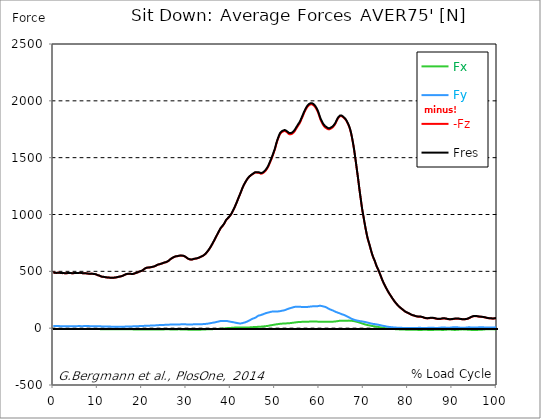
| Category |  Fx |  Fy |  -Fz |  Fres |
|---|---|---|---|---|
| 0.0 | -6.968 | 18.314 | 486.68 | 487.094 |
| 0.167348456675344 | -7.033 | 18.333 | 487.087 | 487.502 |
| 0.334696913350688 | -7.091 | 18.307 | 487.489 | 487.903 |
| 0.5020453700260321 | -6.974 | 18.281 | 486.654 | 487.062 |
| 0.669393826701376 | -6.826 | 18.268 | 485.838 | 486.246 |
| 0.83674228337672 | -6.826 | 18.191 | 486.401 | 486.809 |
| 1.0040907400520642 | -6.871 | 18.145 | 487.159 | 487.56 |
| 1.1621420602454444 | -7.026 | 18.074 | 487.619 | 488.02 |
| 1.3294905169207885 | -7.078 | 17.99 | 487.301 | 487.703 |
| 1.4968389735961325 | -7.11 | 17.919 | 486.602 | 486.997 |
| 1.6641874302714765 | -7.078 | 17.847 | 485.566 | 485.967 |
| 1.8315358869468206 | -7.052 | 17.809 | 484.646 | 485.041 |
| 1.9988843436221646 | -7.039 | 17.802 | 483.947 | 484.348 |
| 2.1662328002975086 | -7.143 | 17.873 | 484.258 | 484.653 |
| 2.333581256972853 | -7.253 | 17.86 | 484.581 | 484.983 |
| 2.5009297136481967 | -7.13 | 17.828 | 483.571 | 483.973 |
| 2.6682781703235405 | -7.052 | 17.718 | 482.962 | 483.357 |
| 2.8356266269988843 | -7.188 | 17.711 | 483.228 | 483.623 |
| 3.002975083674229 | -7.285 | 17.815 | 483.785 | 484.18 |
| 3.1703235403495724 | -7.285 | 17.802 | 484.031 | 484.432 |
| 3.337671997024917 | -7.195 | 17.776 | 484.251 | 484.646 |
| 3.4957233172182973 | -7.098 | 17.737 | 484.899 | 485.287 |
| 3.663071773893641 | -7.123 | 17.653 | 485.553 | 485.941 |
| 3.8304202305689854 | -7.085 | 17.601 | 484.95 | 485.339 |
| 3.997768687244329 | -6.968 | 17.543 | 484.057 | 484.439 |
| 4.165117143919673 | -6.897 | 17.563 | 483.616 | 484.005 |
| 4.332465600595017 | -6.903 | 17.614 | 483.357 | 483.746 |
| 4.499814057270361 | -6.962 | 17.673 | 483.429 | 483.817 |
| 4.667162513945706 | -6.949 | 17.711 | 484.16 | 484.549 |
| 4.834510970621049 | -6.994 | 17.75 | 485.177 | 485.566 |
| 5.001859427296393 | -7.052 | 17.796 | 485.967 | 486.362 |
| 5.169207883971737 | -7.052 | 17.854 | 485.909 | 486.31 |
| 5.336556340647081 | -7.013 | 17.906 | 485.766 | 486.161 |
| 5.503904797322425 | -6.968 | 17.97 | 485.028 | 485.43 |
| 5.671253253997769 | -7.007 | 17.996 | 485.818 | 486.22 |
| 5.82930457419115 | -7.169 | 18.009 | 486.647 | 487.049 |
| 5.996653030866494 | -7.272 | 17.977 | 486.505 | 486.906 |
| 6.164001487541838 | -7.266 | 17.873 | 486.11 | 486.511 |
| 6.331349944217181 | -7.376 | 17.88 | 485.617 | 486.019 |
| 6.498698400892526 | -7.311 | 17.86 | 483.901 | 484.303 |
| 6.66604685756787 | -7.266 | 17.899 | 482.606 | 483.008 |
| 6.833395314243213 | -7.344 | 18.003 | 482.567 | 482.975 |
| 7.000743770918558 | -7.434 | 18.106 | 482.768 | 483.183 |
| 7.168092227593902 | -7.493 | 18.126 | 482.917 | 483.331 |
| 7.335440684269246 | -7.493 | 18.087 | 482.574 | 482.988 |
| 7.50278914094459 | -7.441 | 18.061 | 481.551 | 481.965 |
| 7.6701375976199335 | -7.331 | 18.029 | 480.243 | 480.65 |
| 7.837486054295278 | -7.266 | 18.003 | 479.342 | 479.75 |
| 7.995537374488658 | -7.298 | 17.983 | 479.116 | 479.524 |
| 8.162885831164003 | -7.311 | 17.958 | 478.967 | 479.375 |
| 8.330234287839346 | -7.24 | 17.925 | 479.129 | 479.537 |
| 8.49758274451469 | -7.201 | 17.906 | 479.297 | 479.705 |
| 8.664931201190035 | -7.175 | 17.893 | 479.472 | 479.873 |
| 8.832279657865378 | -7.136 | 17.932 | 478.837 | 479.239 |
| 8.999628114540721 | -6.981 | 17.912 | 477.328 | 477.73 |
| 9.166976571216066 | -7.046 | 17.828 | 476.169 | 476.571 |
| 9.334325027891412 | -7.182 | 17.789 | 475.774 | 476.176 |
| 9.501673484566755 | -7.344 | 17.796 | 474.706 | 475.114 |
| 9.669021941242098 | -7.37 | 17.809 | 472.504 | 472.918 |
| 9.836370397917442 | -7.836 | 17.439 | 468.657 | 469.065 |
| 10.003718854592787 | -8.011 | 17.122 | 465.873 | 466.281 |
| 10.17106731126813 | -8.082 | 16.928 | 464.772 | 465.173 |
| 10.329118631461512 | -8.095 | 16.87 | 463.049 | 463.457 |
| 10.496467088136853 | -8.328 | 16.494 | 459.882 | 460.284 |
| 10.663815544812199 | -8.71 | 15.989 | 456.379 | 456.781 |
| 10.831164001487544 | -9.04 | 15.523 | 453.413 | 453.815 |
| 10.998512458162887 | -9.131 | 15.283 | 452.04 | 452.435 |
| 11.16586091483823 | -9.248 | 15.231 | 451.846 | 452.247 |
| 11.333209371513574 | -9.293 | 15.128 | 451.211 | 451.613 |
| 11.50055782818892 | -9.345 | 15.063 | 450.136 | 450.544 |
| 11.667906284864264 | -9.429 | 14.933 | 448.77 | 449.171 |
| 11.835254741539607 | -9.532 | 14.707 | 447.546 | 447.947 |
| 12.00260319821495 | -9.643 | 14.506 | 446.652 | 447.047 |
| 12.169951654890292 | -9.759 | 14.312 | 445.869 | 446.264 |
| 12.337300111565641 | -9.804 | 14.273 | 445.37 | 445.765 |
| 12.504648568240984 | -9.843 | 14.15 | 444.858 | 445.254 |
| 12.662699888434362 | -9.882 | 13.93 | 444.327 | 444.716 |
| 12.830048345109708 | -9.927 | 13.696 | 444.062 | 444.45 |
| 12.997396801785053 | -9.966 | 13.47 | 443.887 | 444.269 |
| 13.164745258460396 | -9.96 | 13.418 | 443.745 | 444.127 |
| 13.33209371513574 | -9.921 | 13.353 | 443.719 | 444.101 |
| 13.499442171811083 | -9.876 | 13.282 | 443.732 | 444.107 |
| 13.666790628486426 | -9.902 | 13.243 | 444.068 | 444.444 |
| 13.834139085161771 | -9.986 | 13.243 | 444.638 | 445.02 |
| 14.001487541837117 | -10.135 | 13.295 | 445.344 | 445.733 |
| 14.16883599851246 | -10.187 | 13.198 | 446.445 | 446.834 |
| 14.336184455187803 | -10.18 | 13.101 | 447.811 | 448.194 |
| 14.503532911863147 | -10.135 | 13.029 | 449.424 | 449.806 |
| 14.670881368538492 | -10.128 | 13.127 | 451.451 | 451.833 |
| 14.828932688731873 | -10.264 | 13.049 | 452.837 | 453.225 |
| 14.996281145407215 | -10.348 | 12.991 | 453.711 | 454.1 |
| 15.163629602082558 | -10.355 | 13.01 | 454.708 | 455.103 |
| 15.330978058757903 | -10.42 | 13.049 | 456.496 | 456.891 |
| 15.498326515433247 | -10.4 | 13.159 | 458.652 | 459.041 |
| 15.665674972108594 | -10.394 | 13.243 | 461.152 | 461.547 |
| 15.833023428783937 | -10.316 | 13.334 | 464.215 | 464.603 |
| 16.00037188545928 | -10.187 | 13.431 | 467.446 | 467.835 |
| 16.167720342134626 | -10.18 | 13.599 | 470.853 | 471.241 |
| 16.335068798809967 | -10.29 | 13.839 | 473.566 | 473.967 |
| 16.502417255485312 | -10.193 | 14.078 | 475.761 | 476.163 |
| 16.669765712160658 | -10.245 | 14.292 | 477.192 | 477.6 |
| 16.837114168836 | -10.174 | 14.37 | 477.62 | 478.021 |
| 17.004462625511344 | -10.038 | 14.493 | 477.73 | 478.138 |
| 17.16251394570472 | -10.044 | 14.83 | 478.462 | 478.883 |
| 17.32986240238007 | -10.148 | 15.115 | 478.87 | 479.304 |
| 17.497210859055414 | -10.303 | 15.374 | 477.445 | 477.885 |
| 17.664559315730756 | -10.497 | 15.6 | 476.111 | 476.571 |
| 17.8319077724061 | -10.62 | 15.723 | 476.448 | 476.914 |
| 17.999256229081443 | -10.698 | 15.853 | 477.341 | 477.808 |
| 18.166604685756788 | -10.692 | 15.969 | 478.999 | 479.472 |
| 18.333953142432133 | -10.873 | 16.112 | 481.194 | 481.667 |
| 18.501301599107478 | -11.041 | 16.371 | 483.778 | 484.264 |
| 18.668650055782823 | -11.151 | 16.805 | 486.414 | 486.919 |
| 18.835998512458165 | -11.106 | 16.883 | 487.755 | 488.26 |
| 19.00334696913351 | -11.1 | 17.161 | 489.963 | 490.474 |
| 19.170695425808855 | -11.229 | 17.588 | 493.363 | 493.887 |
| 19.338043882484197 | -11.372 | 18.048 | 496.73 | 497.274 |
| 19.496095202677576 | -11.456 | 18.417 | 498.945 | 499.495 |
| 19.66344365935292 | -11.462 | 18.45 | 500.745 | 501.302 |
| 19.830792116028263 | -11.559 | 18.663 | 502.882 | 503.439 |
| 19.998140572703612 | -11.695 | 18.916 | 505.434 | 506.003 |
| 20.165489029378953 | -11.903 | 19.317 | 509.649 | 510.239 |
| 20.3328374860543 | -11.98 | 19.758 | 514.202 | 514.798 |
| 20.500185942729644 | -12.026 | 20.282 | 519.752 | 520.367 |
| 20.667534399404985 | -12.065 | 20.762 | 524.764 | 525.392 |
| 20.83488285608033 | -12.116 | 21.202 | 528.475 | 529.116 |
| 21.002231312755672 | -11.974 | 21.519 | 530.929 | 531.583 |
| 21.16957976943102 | -12 | 21.597 | 532.211 | 532.865 |
| 21.336928226106362 | -12.097 | 21.791 | 532.801 | 533.468 |
| 21.504276682781704 | -12.207 | 22.005 | 533.26 | 533.947 |
| 21.67162513945705 | -12.155 | 22.167 | 533.72 | 534.413 |
| 21.82967645965043 | -12.09 | 22.322 | 534.18 | 534.873 |
| 21.997024916325774 | -12.129 | 22.627 | 535.928 | 536.634 |
| 22.16437337300112 | -12.142 | 22.937 | 537.599 | 538.311 |
| 22.33172182967646 | -12.052 | 23.235 | 538.868 | 539.594 |
| 22.499070286351806 | -11.967 | 23.514 | 540.261 | 540.992 |
| 22.666418743027148 | -11.909 | 23.76 | 541.847 | 542.586 |
| 22.833767199702496 | -11.844 | 23.999 | 543.434 | 544.179 |
| 23.00111565637784 | -11.851 | 24.42 | 546.516 | 547.281 |
| 23.168464113053183 | -11.987 | 24.945 | 550.434 | 551.218 |
| 23.335812569728528 | -12.058 | 25.444 | 554.164 | 554.967 |
| 23.50316102640387 | -11.922 | 25.994 | 557.26 | 558.069 |
| 23.670509483079215 | -11.708 | 26.532 | 559.85 | 560.679 |
| 23.83785793975456 | -11.611 | 26.849 | 561.229 | 562.065 |
| 23.995909259947936 | -11.663 | 27.05 | 562.389 | 563.231 |
| 24.163257716623285 | -11.657 | 27.237 | 564.299 | 565.147 |
| 24.330606173298627 | -11.579 | 27.555 | 566.954 | 567.809 |
| 24.49795462997397 | -11.449 | 27.891 | 569.162 | 570.03 |
| 24.665303086649313 | -11.236 | 28.28 | 570.84 | 571.72 |
| 24.83265154332466 | -11.002 | 28.597 | 573.909 | 574.79 |
| 25.0 | -10.75 | 28.772 | 576.797 | 577.665 |
| 25.167348456675345 | -10.543 | 28.999 | 578.462 | 579.336 |
| 25.334696913350694 | -10.148 | 29.439 | 579.051 | 579.945 |
| 25.502045370026035 | -9.966 | 29.834 | 581.648 | 582.548 |
| 25.669393826701377 | -9.882 | 30.067 | 584.601 | 585.501 |
| 25.836742283376722 | -9.746 | 30.249 | 587.748 | 588.642 |
| 26.004090740052067 | -9.856 | 30.585 | 592.242 | 593.136 |
| 26.17143919672741 | -10.484 | 31.162 | 597.494 | 598.427 |
| 26.329490516920792 | -11.074 | 31.421 | 604.093 | 605.032 |
| 26.49683897359613 | -11.346 | 31.622 | 609.442 | 610.394 |
| 26.66418743027148 | -11.527 | 31.809 | 613.516 | 614.467 |
| 26.831535886946828 | -11.579 | 31.965 | 617.148 | 618.1 |
| 26.998884343622166 | -11.456 | 32.036 | 620.626 | 621.578 |
| 27.166232800297514 | -11.313 | 32.127 | 624.311 | 625.256 |
| 27.333581256972852 | -11.249 | 32.198 | 627.464 | 628.403 |
| 27.5009297136482 | -11.255 | 32.243 | 629.951 | 630.89 |
| 27.668278170323543 | -11.391 | 32.25 | 631.797 | 632.736 |
| 27.835626626998888 | -11.294 | 32.334 | 632.477 | 633.429 |
| 28.002975083674233 | -10.769 | 32.36 | 632.969 | 633.921 |
| 28.170323540349575 | -10.446 | 32.574 | 634.853 | 635.812 |
| 28.33767199702492 | -10.4 | 32.865 | 636.615 | 637.593 |
| 28.50502045370026 | -10.523 | 33.053 | 637.722 | 638.707 |
| 28.663071773893645 | -10.782 | 33.299 | 638.227 | 639.231 |
| 28.830420230568986 | -10.983 | 33.506 | 638.201 | 639.218 |
| 28.99776868724433 | -11.087 | 33.7 | 637.845 | 638.881 |
| 29.165117143919673 | -11.184 | 33.888 | 637.463 | 638.506 |
| 29.33246560059502 | -11.145 | 34.069 | 636.136 | 637.191 |
| 29.499814057270367 | -11.417 | 34.069 | 633.636 | 634.704 |
| 29.66716251394571 | -11.637 | 33.895 | 630.405 | 631.473 |
| 29.834510970621054 | -11.87 | 33.759 | 625.91 | 626.985 |
| 30.00185942729639 | -12.181 | 33.318 | 621.461 | 622.523 |
| 30.169207883971744 | -12.589 | 32.69 | 616.818 | 617.874 |
| 30.33655634064708 | -13.088 | 31.738 | 612.007 | 613.036 |
| 30.50390479732243 | -13.275 | 31.751 | 608.283 | 609.326 |
| 30.671253253997772 | -13.275 | 31.997 | 605.757 | 606.826 |
| 30.829304574191156 | -13.243 | 32.224 | 603.964 | 605.052 |
| 30.996653030866494 | -13.437 | 32.502 | 603.264 | 604.385 |
| 31.164001487541842 | -13.671 | 32.748 | 602.843 | 603.99 |
| 31.331349944217187 | -13.994 | 33.001 | 603.73 | 604.903 |
| 31.498698400892525 | -14.098 | 33.409 | 606.276 | 607.474 |
| 31.666046857567874 | -14.156 | 33.629 | 608.697 | 609.908 |
| 31.833395314243212 | -14.163 | 33.629 | 610.291 | 611.502 |
| 32.00074377091856 | -13.955 | 33.331 | 610.873 | 612.065 |
| 32.1680922275939 | -13.852 | 33.253 | 611.748 | 612.926 |
| 32.33544068426925 | -13.845 | 33.377 | 612.887 | 614.072 |
| 32.50278914094459 | -13.787 | 33.81 | 614.862 | 616.073 |
| 32.670137597619934 | -13.69 | 34.257 | 617.064 | 618.295 |
| 32.83748605429528 | -13.424 | 34.439 | 619.538 | 620.775 |
| 33.004834510970625 | -13.191 | 34.652 | 622.102 | 623.346 |
| 33.162885831164004 | -13.094 | 34.976 | 624.984 | 626.241 |
| 33.33023428783935 | -12.991 | 35.041 | 628.637 | 629.906 |
| 33.497582744514695 | -12.511 | 35.306 | 631.603 | 632.878 |
| 33.664931201190036 | -11.922 | 35.481 | 634.193 | 635.475 |
| 33.83227965786538 | -11.657 | 35.973 | 638.493 | 639.807 |
| 33.99962811454073 | -11.397 | 36.472 | 642.799 | 644.14 |
| 34.16697657121607 | -11.106 | 36.984 | 647.948 | 649.32 |
| 34.33432502789141 | -10.815 | 37.476 | 653.776 | 655.175 |
| 34.50167348456676 | -10.601 | 37.955 | 661.165 | 662.596 |
| 34.6690219412421 | -10.439 | 38.628 | 668.709 | 670.166 |
| 34.83637039791744 | -10.271 | 39.587 | 676.662 | 678.164 |
| 35.00371885459279 | -10.089 | 40.733 | 685.773 | 687.334 |
| 35.17106731126814 | -9.94 | 41.879 | 694.995 | 696.614 |
| 35.338415767943474 | -9.675 | 43.116 | 705.11 | 706.781 |
| 35.49646708813686 | -9.396 | 44.385 | 715.581 | 717.297 |
| 35.6638155448122 | -9.124 | 45.648 | 726.597 | 728.365 |
| 35.831164001487544 | -8.852 | 46.892 | 738.37 | 740.177 |
| 35.998512458162885 | -8.483 | 48.07 | 750.136 | 751.976 |
| 36.165860914838234 | -8.237 | 49.165 | 762.415 | 764.28 |
| 36.333209371513576 | -8.03 | 50.24 | 774.55 | 776.448 |
| 36.50055782818892 | -7.803 | 51.444 | 787.133 | 789.063 |
| 36.667906284864266 | -7.59 | 52.985 | 799.78 | 801.762 |
| 36.83525474153961 | -7.434 | 54.766 | 812.253 | 814.306 |
| 37.002603198214956 | -7.162 | 56.34 | 825.062 | 827.167 |
| 37.1699516548903 | -6.625 | 57.7 | 837.535 | 839.678 |
| 37.337300111565646 | -6.094 | 59.008 | 849.709 | 851.898 |
| 37.50464856824098 | -5.705 | 60.964 | 861.664 | 863.924 |
| 37.66269988843437 | -5.058 | 62.401 | 873.676 | 875.988 |
| 37.83004834510971 | -4.624 | 63.548 | 883.746 | 886.103 |
| 37.99739680178505 | -4.132 | 63.865 | 891.828 | 894.179 |
| 38.16474525846039 | -3.788 | 63.515 | 898.142 | 900.447 |
| 38.33209371513574 | -3.387 | 63.088 | 905.201 | 907.454 |
| 38.49944217181109 | -2.752 | 62.952 | 915.879 | 918.101 |
| 38.666790628486424 | -2.04 | 63.276 | 928.339 | 930.56 |
| 38.83413908516178 | -1.379 | 63.962 | 940.229 | 942.456 |
| 39.001487541837115 | -0.732 | 63.968 | 950.849 | 953.038 |
| 39.16883599851246 | -0.084 | 63.276 | 958.918 | 961.035 |
| 39.336184455187805 | 0.557 | 61.799 | 965.316 | 967.324 |
| 39.503532911863154 | 1.192 | 60.323 | 971.714 | 973.618 |
| 39.670881368538495 | 1.574 | 58.781 | 979.148 | 980.955 |
| 39.83822982521384 | 1.826 | 57.214 | 987.081 | 988.797 |
| 39.996281145407224 | 2.092 | 56.21 | 995.526 | 997.177 |
| 40.163629602082565 | 2.526 | 55.252 | 1006.276 | 1007.862 |
| 40.33097805875791 | 3.16 | 54.047 | 1018.444 | 1019.959 |
| 40.498326515433256 | 3.821 | 52.895 | 1031.098 | 1032.535 |
| 40.6656749721086 | 4.319 | 51.664 | 1043.862 | 1045.228 |
| 40.83302342878393 | 4.986 | 50.233 | 1057.934 | 1059.222 |
| 41.00037188545929 | 5.401 | 48.854 | 1072.88 | 1074.097 |
| 41.16772034213463 | 5.88 | 47.494 | 1087.671 | 1088.817 |
| 41.33506879880997 | 6.197 | 46.348 | 1102.973 | 1104.048 |
| 41.50241725548531 | 6.456 | 45.091 | 1119.266 | 1120.264 |
| 41.66976571216066 | 6.631 | 43.349 | 1135.929 | 1136.842 |
| 41.837114168836 | 6.437 | 42.268 | 1152.08 | 1152.934 |
| 42.004462625511344 | 6.204 | 41.853 | 1168.023 | 1168.852 |
| 42.17181108218669 | 5.964 | 41.692 | 1183.591 | 1184.4 |
| 42.32986240238007 | 5.66 | 42.151 | 1199.651 | 1200.461 |
| 42.497210859055414 | 5.504 | 43.401 | 1217 | 1217.848 |
| 42.66455931573076 | 5.278 | 44.625 | 1233.572 | 1234.465 |
| 42.831907772406105 | 5.103 | 46.38 | 1248.052 | 1249.01 |
| 42.999256229081446 | 4.935 | 48.498 | 1261.58 | 1262.622 |
| 43.16660468575679 | 4.831 | 50.065 | 1273.262 | 1274.369 |
| 43.33395314243214 | 4.863 | 51.781 | 1284.847 | 1286.007 |
| 43.50130159910748 | 5.09 | 54.306 | 1295.934 | 1297.19 |
| 43.66865005578282 | 5.407 | 57.214 | 1306.121 | 1307.5 |
| 43.83599851245817 | 5.802 | 60.31 | 1315.575 | 1317.091 |
| 44.00334696913351 | 6.178 | 63.573 | 1323.981 | 1325.645 |
| 44.17069542580886 | 6.592 | 66.967 | 1331.202 | 1333.028 |
| 44.3380438824842 | 6.987 | 70.49 | 1337.205 | 1339.219 |
| 44.49609520267758 | 7.428 | 73.987 | 1342.308 | 1344.516 |
| 44.66344365935292 | 7.991 | 77.49 | 1347.048 | 1349.463 |
| 44.83079211602827 | 8.509 | 80.812 | 1351.691 | 1354.327 |
| 44.99814057270361 | 9.001 | 83.772 | 1355.939 | 1358.763 |
| 45.16548902937895 | 9.461 | 86.284 | 1359.682 | 1362.674 |
| 45.332837486054295 | 9.889 | 88.24 | 1364.895 | 1367.997 |
| 45.500185942729644 | 10.323 | 90.85 | 1368.444 | 1371.701 |
| 45.66753439940499 | 10.601 | 94.075 | 1369.137 | 1372.602 |
| 45.83488285608033 | 10.996 | 99.106 | 1368.509 | 1372.433 |
| 46.00223131275568 | 11.397 | 104.203 | 1367.842 | 1372.239 |
| 46.16957976943102 | 11.754 | 107.784 | 1367.499 | 1372.291 |
| 46.336928226106366 | 12.129 | 111.126 | 1366.851 | 1372.012 |
| 46.50427668278171 | 12.563 | 113.243 | 1364.474 | 1369.862 |
| 46.671625139457056 | 12.421 | 113.761 | 1359.715 | 1365.167 |
| 46.829676459650436 | 13.094 | 115.944 | 1358.627 | 1364.261 |
| 46.99702491632577 | 13.839 | 118.171 | 1359.695 | 1365.524 |
| 47.16437337300112 | 14.454 | 120.321 | 1361.819 | 1367.842 |
| 47.33172182967646 | 15.011 | 122.555 | 1365.524 | 1371.727 |
| 47.49907028635181 | 15.665 | 125.081 | 1370.516 | 1376.934 |
| 47.66641874302716 | 16.455 | 128.008 | 1376.429 | 1383.099 |
| 47.83376719970249 | 17.252 | 130.806 | 1382.969 | 1389.879 |
| 48.001115656377834 | 18.009 | 132.807 | 1390.831 | 1397.89 |
| 48.16846411305319 | 18.903 | 134.503 | 1400.694 | 1407.856 |
| 48.33581256972853 | 19.829 | 135.96 | 1411.457 | 1418.703 |
| 48.50316102640387 | 20.917 | 137.385 | 1424.149 | 1431.461 |
| 48.67050948307921 | 22.212 | 139.296 | 1438.008 | 1445.435 |
| 48.837857939754564 | 23.527 | 141.219 | 1453.848 | 1461.386 |
| 49.005206396429905 | 24.718 | 143.116 | 1469.318 | 1476.973 |
| 49.163257716623285 | 25.729 | 143.9 | 1484.789 | 1492.424 |
| 49.33060617329863 | 27.004 | 145.584 | 1501.555 | 1509.294 |
| 49.49795462997397 | 28.183 | 146.361 | 1518.982 | 1526.707 |
| 49.66530308664932 | 29.368 | 146.704 | 1537.056 | 1544.71 |
| 49.832651543324666 | 30.689 | 147.397 | 1556.373 | 1564.015 |
| 50.0 | 31.939 | 147.747 | 1575.93 | 1583.52 |
| 50.16734845667534 | 32.891 | 147.403 | 1599.703 | 1607.176 |
| 50.33469691335069 | 33.791 | 146.989 | 1624.765 | 1632.115 |
| 50.50204537002604 | 34.808 | 147.086 | 1645.086 | 1652.384 |
| 50.66939382670139 | 35.591 | 147.17 | 1663.568 | 1670.808 |
| 50.836742283376715 | 36.472 | 147.675 | 1681.215 | 1688.448 |
| 51.00409074005207 | 37.586 | 148.873 | 1697.003 | 1704.301 |
| 51.17143919672741 | 38.136 | 149.553 | 1710.473 | 1717.771 |
| 51.32949051692079 | 38.745 | 150.81 | 1719.079 | 1726.455 |
| 51.496838973596134 | 39.438 | 152.571 | 1724.376 | 1731.882 |
| 51.66418743027148 | 40.008 | 154.086 | 1727.42 | 1735.035 |
| 51.831535886946824 | 40.383 | 155.187 | 1730.645 | 1738.345 |
| 51.99888434362217 | 40.772 | 156.431 | 1734.789 | 1742.58 |
| 52.16623280029752 | 41.115 | 158.095 | 1735.826 | 1743.765 |
| 52.33358125697285 | 41.387 | 159.947 | 1733.533 | 1741.66 |
| 52.5009297136482 | 41.899 | 162.894 | 1729.699 | 1738.112 |
| 52.668278170323546 | 42.417 | 165.892 | 1725.121 | 1733.844 |
| 52.835626626998895 | 42.818 | 168.243 | 1719.137 | 1728.139 |
| 53.00297508367424 | 43.22 | 170.587 | 1713.16 | 1722.433 |
| 53.17032354034958 | 43.673 | 172.756 | 1707.157 | 1716.735 |
| 53.33767199702492 | 44.152 | 174.796 | 1703.012 | 1712.869 |
| 53.50502045370027 | 44.78 | 176.59 | 1705.829 | 1715.893 |
| 53.663071773893655 | 45.648 | 178.649 | 1707.779 | 1718.082 |
| 53.83042023056899 | 46.568 | 180.644 | 1709.754 | 1720.296 |
| 53.99776868724433 | 47.552 | 182.548 | 1714.85 | 1725.6 |
| 54.16511714391967 | 48.517 | 184.445 | 1720.128 | 1731.092 |
| 54.33246560059503 | 49.229 | 186.187 | 1727.135 | 1738.26 |
| 54.49981405727037 | 50.045 | 187.599 | 1735.864 | 1747.113 |
| 54.667162513945705 | 51.023 | 188.473 | 1747.443 | 1758.737 |
| 54.834510970621054 | 51.923 | 189.101 | 1758.232 | 1769.532 |
| 55.0018594272964 | 52.752 | 189.509 | 1768.354 | 1779.641 |
| 55.169207883971744 | 53.555 | 189.943 | 1779.266 | 1790.54 |
| 55.336556340647086 | 53.97 | 189.27 | 1789.232 | 1800.357 |
| 55.50390479732243 | 54.248 | 188.13 | 1798.292 | 1809.216 |
| 55.671253253997776 | 54.63 | 187.592 | 1811.483 | 1822.272 |
| 55.83860171067312 | 55.071 | 187.489 | 1825.542 | 1836.24 |
| 55.9966530308665 | 55.356 | 187.126 | 1840.948 | 1851.53 |
| 56.16400148754184 | 55.602 | 186.647 | 1856.011 | 1866.456 |
| 56.33134994421718 | 55.893 | 186.258 | 1871.216 | 1881.545 |
| 56.498698400892536 | 56.172 | 186.096 | 1887.749 | 1897.981 |
| 56.66604685756788 | 56.392 | 185.572 | 1902.222 | 1912.318 |
| 56.83339531424321 | 56.476 | 186.045 | 1915.712 | 1925.782 |
| 57.00074377091856 | 56.625 | 186.381 | 1927.783 | 1937.82 |
| 57.16809222759391 | 56.657 | 186.602 | 1939.167 | 1949.172 |
| 57.33544068426925 | 56.638 | 186.848 | 1948.687 | 1958.666 |
| 57.5027891409446 | 57.052 | 187.871 | 1955.972 | 1966.023 |
| 57.670137597619934 | 57.35 | 188.823 | 1961.878 | 1972.006 |
| 57.83748605429528 | 57.745 | 189.386 | 1966.353 | 1976.526 |
| 58.004834510970625 | 58.283 | 189.865 | 1968.878 | 1979.11 |
| 58.16288583116401 | 58.6 | 190.668 | 1969.934 | 1980.25 |
| 58.330234287839346 | 58.794 | 191.433 | 1968.963 | 1979.363 |
| 58.497582744514695 | 58.665 | 191.905 | 1966.418 | 1976.883 |
| 58.66493120119004 | 58.451 | 192.682 | 1961.833 | 1972.382 |
| 58.832279657865385 | 58.16 | 192.65 | 1955.687 | 1966.262 |
| 58.999628114540734 | 57.926 | 192.812 | 1948.214 | 1958.821 |
| 59.16697657121607 | 57.816 | 192.715 | 1939.31 | 1949.962 |
| 59.33432502789142 | 57.849 | 193.596 | 1928.456 | 1939.251 |
| 59.50167348456676 | 57.803 | 193.57 | 1916.489 | 1927.349 |
| 59.66902194124211 | 57.454 | 193.893 | 1902.041 | 1912.998 |
| 59.83637039791745 | 57.104 | 194.774 | 1883.922 | 1895.041 |
| 60.00371885459278 | 56.987 | 196.361 | 1864.015 | 1875.387 |
| 60.17106731126813 | 56.722 | 197.254 | 1844.898 | 1856.451 |
| 60.33841576794349 | 56.01 | 196.199 | 1828.042 | 1839.562 |
| 60.49646708813685 | 55.751 | 194.949 | 1814.06 | 1825.516 |
| 60.6638155448122 | 55.686 | 193.596 | 1801.173 | 1812.571 |
| 60.831164001487544 | 55.764 | 192.19 | 1789.698 | 1801.037 |
| 60.99851245816289 | 55.822 | 190.591 | 1779.978 | 1791.213 |
| 61.16586091483824 | 55.809 | 188.661 | 1772.032 | 1783.119 |
| 61.333209371513576 | 55.861 | 186.828 | 1766.094 | 1777.025 |
| 61.50055782818892 | 55.88 | 184.549 | 1761.114 | 1771.825 |
| 61.667906284864266 | 56.126 | 180.903 | 1757.306 | 1767.68 |
| 61.835254741539615 | 56.418 | 177.063 | 1753.271 | 1763.309 |
| 62.002603198214956 | 56.69 | 173.41 | 1749.606 | 1759.333 |
| 62.16995165489029 | 56.897 | 170.334 | 1749.069 | 1758.517 |
| 62.33730011156564 | 57.046 | 167.025 | 1750.383 | 1759.527 |
| 62.504648568240995 | 57.169 | 163.619 | 1753.569 | 1762.396 |
| 62.67199702491633 | 56.916 | 161.067 | 1757.863 | 1766.411 |
| 62.83004834510971 | 56.728 | 158.924 | 1761.975 | 1770.277 |
| 62.99739680178505 | 56.877 | 156.696 | 1766.657 | 1774.713 |
| 63.1647452584604 | 57.376 | 153.374 | 1774.24 | 1781.972 |
| 63.33209371513575 | 57.959 | 149.942 | 1781.972 | 1789.387 |
| 63.4994421718111 | 58.593 | 146.73 | 1790.954 | 1798.071 |
| 63.666790628486424 | 59.325 | 143.816 | 1802.553 | 1809.378 |
| 63.83413908516177 | 60.076 | 141.089 | 1816.761 | 1823.314 |
| 64.00148754183712 | 61.106 | 138.991 | 1830.69 | 1837.056 |
| 64.16883599851248 | 62.168 | 136.731 | 1843.363 | 1849.541 |
| 64.3361844551878 | 63.314 | 134.05 | 1852.579 | 1858.575 |
| 64.50353291186315 | 64.422 | 131.635 | 1859.851 | 1865.692 |
| 64.6708813685385 | 65.309 | 129.459 | 1865.867 | 1871.579 |
| 64.83822982521384 | 65.833 | 126.532 | 1867.629 | 1873.159 |
| 65.00557828188919 | 66.241 | 123.235 | 1866.418 | 1871.754 |
| 65.16362960208257 | 66.313 | 121.565 | 1862.383 | 1867.635 |
| 65.3309780587579 | 66.17 | 119.531 | 1857.202 | 1862.331 |
| 65.49832651543326 | 65.944 | 117.342 | 1851.523 | 1856.509 |
| 65.6656749721086 | 65.769 | 115.231 | 1845.831 | 1850.675 |
| 65.83302342878395 | 65.607 | 112.123 | 1839.064 | 1843.726 |
| 66.00037188545929 | 65.393 | 108.283 | 1830.69 | 1835.12 |
| 66.16772034213463 | 65.523 | 104.915 | 1819.85 | 1824.117 |
| 66.33506879880998 | 66.002 | 101.956 | 1807.526 | 1811.664 |
| 66.50241725548531 | 66.371 | 98.815 | 1794.244 | 1798.24 |
| 66.66976571216065 | 66.41 | 95.344 | 1778.728 | 1782.575 |
| 66.83711416883601 | 66.358 | 91.834 | 1760.971 | 1764.662 |
| 67.00446262551135 | 66.183 | 88.389 | 1739.821 | 1743.376 |
| 67.1718110821867 | 65.581 | 85.041 | 1713.38 | 1716.799 |
| 67.32986240238007 | 64.694 | 81.816 | 1682.51 | 1685.8 |
| 67.49721085905541 | 63.716 | 78.979 | 1648.563 | 1651.743 |
| 67.66455931573076 | 62.66 | 76.674 | 1612.072 | 1615.18 |
| 67.83190777240611 | 61.689 | 74.505 | 1572.058 | 1575.108 |
| 67.99925622908145 | 60.329 | 72.167 | 1526.817 | 1529.803 |
| 68.16660468575678 | 58.898 | 70.127 | 1480.994 | 1483.934 |
| 68.33395314243214 | 57.467 | 68.586 | 1433.941 | 1436.861 |
| 68.50130159910749 | 55.757 | 66.87 | 1384.142 | 1387.023 |
| 68.66865005578282 | 54.183 | 65.795 | 1337.898 | 1340.766 |
| 68.83599851245816 | 52.228 | 64.363 | 1287.075 | 1289.905 |
| 69.00334696913352 | 50.13 | 63.062 | 1234.077 | 1236.874 |
| 69.17069542580886 | 48.07 | 61.948 | 1184.97 | 1187.742 |
| 69.3380438824842 | 45.933 | 60.905 | 1138.487 | 1141.226 |
| 69.50539233915956 | 43.336 | 59.915 | 1090.352 | 1093.046 |
| 69.66344365935292 | 41.025 | 58.963 | 1045.228 | 1047.877 |
| 69.83079211602826 | 39.062 | 57.862 | 1007.811 | 1010.42 |
| 69.99814057270362 | 37.061 | 56.67 | 971.649 | 974.22 |
| 70.16548902937896 | 34.814 | 55.394 | 933.079 | 935.585 |
| 70.33283748605429 | 32.82 | 54.145 | 896.931 | 899.379 |
| 70.50018594272964 | 30.987 | 52.552 | 861.929 | 864.299 |
| 70.667534399405 | 29.213 | 50.933 | 829.802 | 832.082 |
| 70.83488285608033 | 27.542 | 49.236 | 800.441 | 802.623 |
| 71.00223131275568 | 26.363 | 47.623 | 775.081 | 777.18 |
| 71.16957976943102 | 25.379 | 46.063 | 752.895 | 754.916 |
| 71.33692822610637 | 24.343 | 44.573 | 731.085 | 733.021 |
| 71.50427668278171 | 22.899 | 42.896 | 706.832 | 708.659 |
| 71.67162513945706 | 21.416 | 41.29 | 682.716 | 684.445 |
| 71.8389735961324 | 20.004 | 39.703 | 660.355 | 661.981 |
| 71.99702491632577 | 18.657 | 38.162 | 639.769 | 641.297 |
| 72.16437337300113 | 17.465 | 37.048 | 622.148 | 623.598 |
| 72.33172182967647 | 16.513 | 36.388 | 606.295 | 607.707 |
| 72.49907028635181 | 15.801 | 36.058 | 591.757 | 593.162 |
| 72.66641874302715 | 14.81 | 34.995 | 572.718 | 574.071 |
| 72.8337671997025 | 13.645 | 33.558 | 554.216 | 555.485 |
| 73.00111565637783 | 12.57 | 32.159 | 537.67 | 538.862 |
| 73.16846411305319 | 11.449 | 31 | 524.078 | 525.204 |
| 73.33581256972853 | 10.245 | 29.834 | 510.025 | 511.081 |
| 73.50316102640387 | 9.001 | 28.533 | 494.47 | 495.448 |
| 73.67050948307921 | 7.81 | 27.043 | 477.51 | 478.403 |
| 73.83785793975457 | 6.625 | 25.359 | 461.43 | 462.227 |
| 74.00520639642991 | 5.414 | 23.74 | 444.217 | 444.923 |
| 74.16325771662328 | 4.183 | 22.549 | 427.341 | 428.002 |
| 74.33060617329863 | 3.031 | 21.202 | 411.825 | 412.427 |
| 74.49795462997398 | 2.215 | 19.687 | 397.889 | 398.42 |
| 74.66530308664932 | 1.315 | 18.385 | 384.031 | 384.51 |
| 74.83265154332466 | 0.408 | 17.155 | 371.222 | 371.655 |
| 75.00000000000001 | -0.55 | 15.853 | 358.574 | 358.969 |
| 75.16734845667534 | -1.574 | 14.409 | 346.717 | 347.067 |
| 75.3346969133507 | -2.441 | 13.282 | 334.465 | 334.788 |
| 75.50204537002605 | -3.218 | 12.213 | 323.002 | 323.307 |
| 75.66939382670138 | -3.924 | 11.164 | 311.916 | 312.207 |
| 75.83674228337672 | -4.604 | 10.258 | 301.321 | 301.606 |
| 76.00409074005208 | -5.194 | 9.468 | 291.575 | 291.86 |
| 76.17143919672742 | -5.738 | 8.814 | 281.486 | 281.764 |
| 76.33878765340276 | -6.236 | 8.049 | 271.118 | 271.396 |
| 76.49683897359614 | -6.955 | 7.421 | 261.067 | 261.365 |
| 76.66418743027148 | -7.447 | 6.949 | 251.826 | 252.144 |
| 76.83153588694682 | -7.829 | 6.385 | 242.579 | 242.903 |
| 76.99888434362218 | -8.231 | 5.867 | 233.688 | 234.031 |
| 77.16623280029752 | -8.652 | 5.459 | 224.952 | 225.321 |
| 77.33358125697285 | -9.047 | 5.032 | 217.181 | 217.576 |
| 77.5009297136482 | -9.481 | 4.507 | 210.187 | 210.601 |
| 77.66827817032356 | -9.83 | 4.015 | 202.83 | 203.257 |
| 77.83562662699889 | -10.277 | 3.737 | 195.823 | 196.296 |
| 78.00297508367423 | -10.743 | 3.426 | 189.516 | 190.047 |
| 78.17032354034959 | -10.97 | 3.167 | 183.344 | 183.895 |
| 78.33767199702493 | -11.378 | 2.823 | 177.743 | 178.338 |
| 78.50502045370027 | -11.805 | 2.778 | 172.543 | 173.177 |
| 78.67236891037561 | -12.168 | 2.642 | 167.815 | 168.476 |
| 78.83042023056899 | -12.285 | 2.182 | 162.609 | 163.289 |
| 78.99776868724433 | -12.265 | 1.677 | 157.104 | 157.791 |
| 79.16511714391969 | -12.33 | 1.444 | 151.716 | 152.429 |
| 79.33246560059503 | -12.628 | 1.509 | 146.808 | 147.572 |
| 79.49981405727036 | -13.075 | 1.664 | 142.644 | 143.466 |
| 79.66716251394571 | -13.58 | 1.884 | 139.386 | 140.267 |
| 79.83451097062107 | -13.858 | 1.91 | 136.679 | 137.605 |
| 80.00185942729641 | -13.91 | 1.748 | 133.849 | 134.795 |
| 80.16920788397174 | -13.845 | 1.489 | 130.929 | 131.881 |
| 80.33655634064709 | -13.658 | 1.12 | 127.231 | 128.17 |
| 80.50390479732243 | -13.411 | 0.978 | 123.203 | 124.149 |
| 80.67125325399778 | -13.34 | 0.926 | 119.887 | 120.839 |
| 80.83860171067312 | -13.632 | 1.14 | 116.921 | 117.912 |
| 80.99665303086651 | -14.111 | 1.541 | 114.331 | 115.387 |
| 81.16400148754184 | -14.629 | 2.001 | 112.498 | 113.632 |
| 81.3313499442172 | -14.577 | 1.936 | 111.041 | 112.181 |
| 81.49869840089255 | -14.402 | 1.813 | 108.969 | 110.102 |
| 81.66604685756786 | -14.26 | 1.567 | 106.269 | 107.389 |
| 81.83339531424322 | -14.551 | 1.723 | 104.378 | 105.556 |
| 82.00074377091858 | -14.622 | 1.794 | 102.726 | 103.931 |
| 82.16809222759392 | -14.979 | 2.234 | 101.619 | 102.901 |
| 82.33544068426926 | -15.413 | 2.798 | 101.347 | 102.72 |
| 82.50278914094459 | -15.736 | 3.108 | 101.502 | 102.934 |
| 82.67013759761994 | -15.898 | 3.199 | 101.457 | 102.921 |
| 82.83748605429528 | -15.743 | 2.798 | 100.803 | 102.234 |
| 83.00483451097062 | -15.594 | 2.351 | 99.618 | 101.043 |
| 83.17218296764597 | -15.328 | 1.813 | 97.986 | 99.378 |
| 83.33023428783935 | -14.882 | 1.153 | 95.959 | 97.3 |
| 83.4975827445147 | -14.383 | 0.609 | 93.667 | 94.968 |
| 83.66493120119004 | -14.137 | 0.557 | 91.18 | 92.488 |
| 83.83227965786537 | -14.066 | 0.628 | 89.004 | 90.332 |
| 83.99962811454073 | -14.247 | 0.945 | 87.56 | 88.946 |
| 84.16697657121607 | -14.603 | 1.457 | 86.634 | 88.104 |
| 84.33432502789142 | -15.043 | 2.118 | 86.129 | 87.702 |
| 84.50167348456677 | -15.471 | 2.862 | 86.174 | 87.858 |
| 84.6690219412421 | -15.931 | 3.575 | 86.75 | 88.538 |
| 84.83637039791745 | -16.455 | 4.235 | 87.702 | 89.593 |
| 85.0037188545928 | -16.805 | 4.643 | 88.939 | 90.901 |
| 85.17106731126813 | -16.831 | 4.74 | 89.716 | 91.679 |
| 85.33841576794349 | -16.624 | 4.585 | 90.021 | 91.938 |
| 85.50576422461883 | -16.267 | 4.216 | 89.781 | 91.62 |
| 85.66381554481221 | -15.769 | 3.762 | 89.134 | 90.876 |
| 85.83116400148755 | -15.121 | 3.18 | 88.259 | 89.885 |
| 85.99851245816289 | -14.467 | 2.493 | 87.107 | 88.616 |
| 86.16586091483823 | -13.8 | 1.846 | 85.52 | 86.932 |
| 86.33320937151358 | -13.36 | 1.548 | 83.733 | 85.099 |
| 86.50055782818893 | -13.12 | 1.535 | 82.243 | 83.603 |
| 86.66790628486427 | -13.094 | 1.884 | 81.272 | 82.658 |
| 86.83525474153961 | -13.198 | 2.48 | 80.689 | 82.127 |
| 87.00260319821496 | -13.509 | 3.199 | 80.469 | 81.984 |
| 87.16995165489031 | -13.884 | 3.95 | 80.637 | 82.243 |
| 87.33730011156564 | -14.376 | 4.773 | 81.265 | 82.982 |
| 87.504648568241 | -14.959 | 5.628 | 82.392 | 84.231 |
| 87.67199702491634 | -15.49 | 6.327 | 83.752 | 85.701 |
| 87.83004834510972 | -15.438 | 6.456 | 84.711 | 86.647 |
| 87.99739680178506 | -15.302 | 6.379 | 85.229 | 87.139 |
| 88.1647452584604 | -15.03 | 6.074 | 85.229 | 87.087 |
| 88.33209371513574 | -14.538 | 5.485 | 84.782 | 86.543 |
| 88.49944217181108 | -13.917 | 4.773 | 83.953 | 85.611 |
| 88.66679062848644 | -13.282 | 4.06 | 82.677 | 84.238 |
| 88.83413908516178 | -12.712 | 3.581 | 80.883 | 82.366 |
| 89.00148754183712 | -12.246 | 3.244 | 79.29 | 80.721 |
| 89.16883599851246 | -12.136 | 3.4 | 78.345 | 79.789 |
| 89.33618445518782 | -12.123 | 3.769 | 77.632 | 79.09 |
| 89.50353291186315 | -12.317 | 4.417 | 77.386 | 78.908 |
| 89.6708813685385 | -12.673 | 5.168 | 77.542 | 79.148 |
| 89.83822982521386 | -13.217 | 6.048 | 77.963 | 79.685 |
| 90.00557828188919 | -13.819 | 6.877 | 78.798 | 80.65 |
| 90.16362960208257 | -14.512 | 7.777 | 79.841 | 81.848 |
| 90.3309780587579 | -15.037 | 8.568 | 81.032 | 83.163 |
| 90.49832651543326 | -15.257 | 8.878 | 82.01 | 84.18 |
| 90.66567497210859 | -15.212 | 8.775 | 82.664 | 84.788 |
| 90.83302342878395 | -15.017 | 8.477 | 83.105 | 85.144 |
| 91.00037188545929 | -14.7 | 8.024 | 83.338 | 85.261 |
| 91.16772034213463 | -14.221 | 7.447 | 83.241 | 85.008 |
| 91.33506879880998 | -13.658 | 6.664 | 82.969 | 84.568 |
| 91.50241725548533 | -12.971 | 5.776 | 82.535 | 83.966 |
| 91.66976571216065 | -12.252 | 4.844 | 81.868 | 83.143 |
| 91.83711416883601 | -11.644 | 3.989 | 80.592 | 81.745 |
| 92.00446262551137 | -11.132 | 3.387 | 79.29 | 80.352 |
| 92.1718110821867 | -10.724 | 2.888 | 78.157 | 79.141 |
| 92.33915953886203 | -10.588 | 2.778 | 77.561 | 78.526 |
| 92.49721085905541 | -10.594 | 2.94 | 77.289 | 78.248 |
| 92.66455931573077 | -10.841 | 3.4 | 77.438 | 78.435 |
| 92.83190777240611 | -11.19 | 3.996 | 77.846 | 78.902 |
| 92.99925622908145 | -11.663 | 4.565 | 78.869 | 80.003 |
| 93.1666046857568 | -12.246 | 5.407 | 79.944 | 81.188 |
| 93.33395314243214 | -12.79 | 6.055 | 81.356 | 82.703 |
| 93.50130159910749 | -13.288 | 6.741 | 83.007 | 84.458 |
| 93.66865005578283 | -13.936 | 7.311 | 85.514 | 87.074 |
| 93.83599851245818 | -14.266 | 7.156 | 88.583 | 90.144 |
| 94.00334696913353 | -14.72 | 6.974 | 92.184 | 93.751 |
| 94.17069542580886 | -15.153 | 6.864 | 95.732 | 97.319 |
| 94.3380438824842 | -15.471 | 6.78 | 98.815 | 100.415 |
| 94.50539233915954 | -15.652 | 6.806 | 101.321 | 102.927 |
| 94.66344365935292 | -15.782 | 6.871 | 103.633 | 105.239 |
| 94.83079211602828 | -15.859 | 6.871 | 105.304 | 106.903 |
| 94.99814057270362 | -15.879 | 6.787 | 106.146 | 107.739 |
| 95.16548902937897 | -15.652 | 6.469 | 106.113 | 107.648 |
| 95.33283748605432 | -15.749 | 6.437 | 105.679 | 107.221 |
| 95.50018594272963 | -15.892 | 6.443 | 105.213 | 106.767 |
| 95.66753439940499 | -15.568 | 6.677 | 103.95 | 105.479 |
| 95.83488285608034 | -15.166 | 6.91 | 102.681 | 104.183 |
| 96.00223131275567 | -14.396 | 7.117 | 101.405 | 102.849 |
| 96.16957976943102 | -13.729 | 7.188 | 100.337 | 101.716 |
| 96.33692822610638 | -13.573 | 7.072 | 100.227 | 101.567 |
| 96.50427668278171 | -13.573 | 7.013 | 100.395 | 101.716 |
| 96.67162513945706 | -13.269 | 7.227 | 99.359 | 100.693 |
| 96.8389735961324 | -12.9 | 7.486 | 98.141 | 99.488 |
| 96.99702491632577 | -12.479 | 7.667 | 97.112 | 98.472 |
| 97.16437337300111 | -11.754 | 6.916 | 96.257 | 97.507 |
| 97.33172182967647 | -11.061 | 6.165 | 95.007 | 96.16 |
| 97.49907028635181 | -10.452 | 5.634 | 93.311 | 94.398 |
| 97.66641874302715 | -9.655 | 5.284 | 91.569 | 92.592 |
| 97.8337671997025 | -9.332 | 5.084 | 89.911 | 90.914 |
| 98.00111565637785 | -9.248 | 4.967 | 88.447 | 89.451 |
| 98.16846411305319 | -9.196 | 5.058 | 87.443 | 88.46 |
| 98.33581256972855 | -9.228 | 5.2 | 86.718 | 87.748 |
| 98.50316102640389 | -9.364 | 5.42 | 86.194 | 87.249 |
| 98.67050948307921 | -9.448 | 5.537 | 86.207 | 87.281 |
| 98.83785793975456 | -9.384 | 5.479 | 85.481 | 86.563 |
| 99.0052063964299 | -9.248 | 5.278 | 84.788 | 85.863 |
| 99.17255485310525 | -9.416 | 5.511 | 84.497 | 85.617 |
| 99.33060617329863 | -9.869 | 6.068 | 84.704 | 85.922 |
| 99.49795462997399 | -10.413 | 6.69 | 85.235 | 86.563 |
| 99.66530308664933 | -10.977 | 7.318 | 86.187 | 87.625 |
| 99.83265154332467 | -11.501 | 7.894 | 87.379 | 88.92 |
| 100.0 | -11.916 | 8.257 | 88.46 | 90.079 |